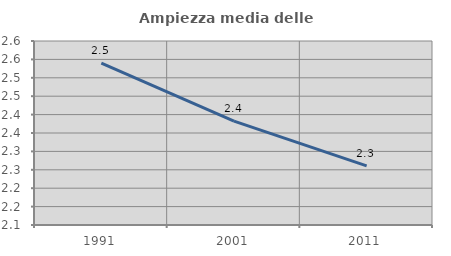
| Category | Ampiezza media delle famiglie |
|---|---|
| 1991.0 | 2.54 |
| 2001.0 | 2.382 |
| 2011.0 | 2.261 |